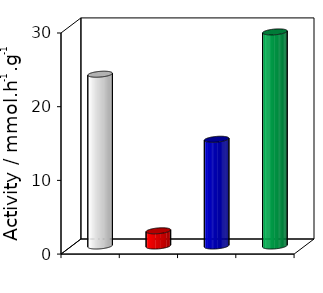
| Category | Series 0 |
|---|---|
| SBA-15 | 23.308 |
| Fe3O4@nSiO2(toluene) | 2.064 |
| Fe3O4@nSiO2@mSiO2(toluene) | 14.482 |
| Fe3O4@nSiO2@mSiO2(HSPG) | 29.048 |